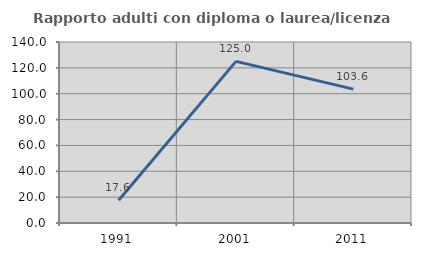
| Category | Rapporto adulti con diploma o laurea/licenza media  |
|---|---|
| 1991.0 | 17.647 |
| 2001.0 | 125 |
| 2011.0 | 103.571 |